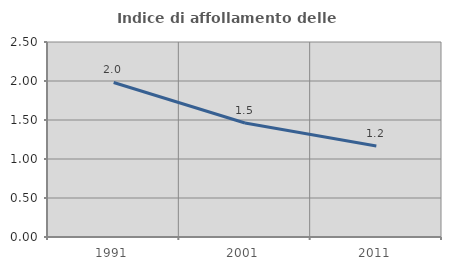
| Category | Indice di affollamento delle abitazioni  |
|---|---|
| 1991.0 | 1.981 |
| 2001.0 | 1.461 |
| 2011.0 | 1.166 |